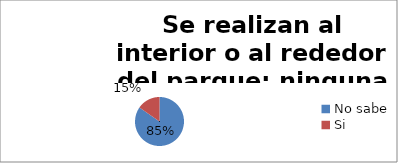
| Category | Series 0 |
|---|---|
| No sabe | 0.847 |
| Si | 0.153 |